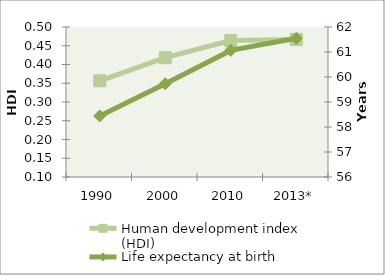
| Category | Human development index (HDI) |
|---|---|
| 1990 | 0.357 |
| 2000 | 0.418 |
| 2010 | 0.464 |
| 2013* | 0.467 |